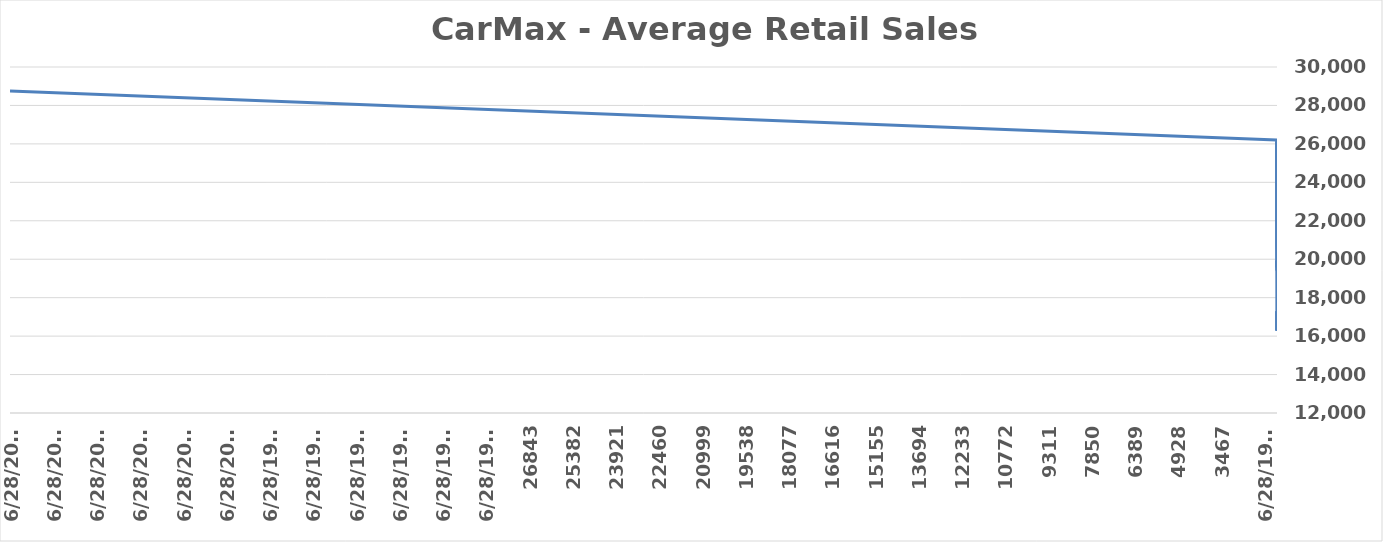
| Category |   Used vehicles |
|---|---|
| 8/31/22 | 28755 |
| 7/14/05 | 26207 |
| 7/13/05 | 20690 |
| 7/12/05 | 20418 |
| 7/11/05 | 20077 |
| 7/10/05 | 19757 |
| 7/9/05 | 19586 |
| 7/8/05 | 19917 |
| 7/7/05 | 19897 |
| 7/6/05 | 19408 |
| 7/5/05 | 19351 |
| 7/4/05 | 18995 |
| 7/3/05 | 18019 |
| 7/2/05 | 17152 |
| 7/1/05 | 16291 |
| 6/30/05 | 17298 |
| 6/29/05 | 17249 |
| 6/28/05 | 16298 |